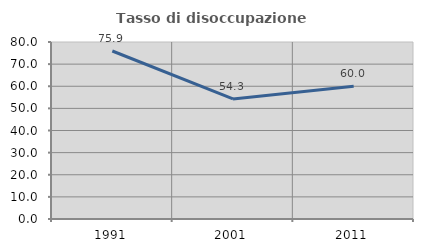
| Category | Tasso di disoccupazione giovanile  |
|---|---|
| 1991.0 | 75.926 |
| 2001.0 | 54.286 |
| 2011.0 | 60 |